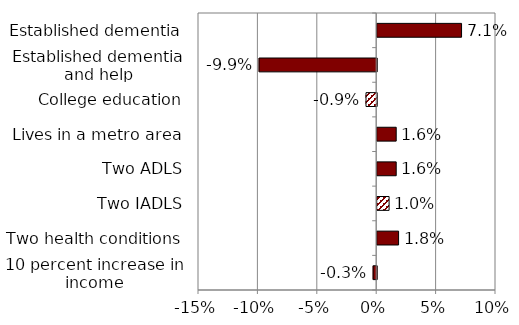
| Category | Series 0 |
|---|---|
| 10 percent increase in income | -0.003 |
| Two health conditions | 0.018 |
| Two IADLS | 0.01 |
| Two ADLS | 0.016 |
| Lives in a metro area | 0.016 |
| College education | -0.009 |
| Established dementia and help | -0.099 |
| Established dementia | 0.071 |